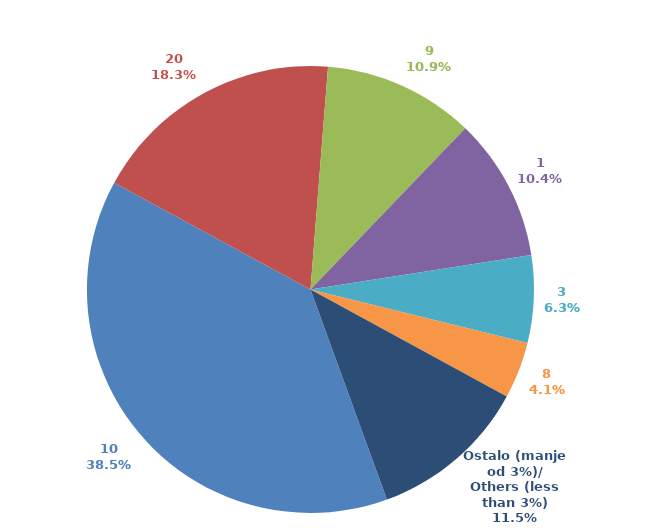
| Category | Series 0 |
|---|---|
| 10 | 0.385 |
| 20 | 0.183 |
| 9 | 0.109 |
| 1 | 0.104 |
| 3 | 0.063 |
| 8 | 0.041 |
| Ostalo (manje od 3%)/
Others (less than 3%) | 0.115 |